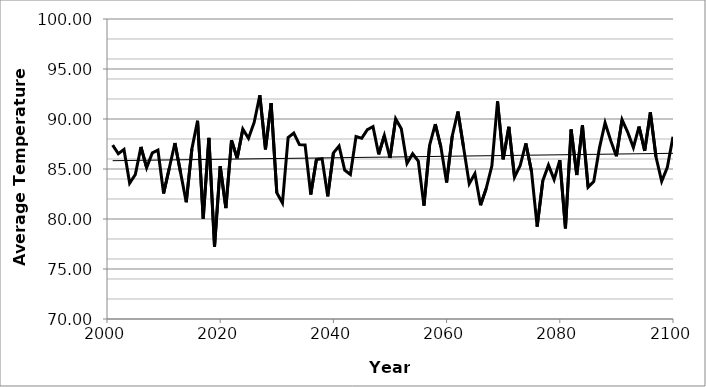
| Category | Committed |
|---|---|
| 2001.0 | 87.39 |
| 2002.0 | 86.527 |
| 2003.0 | 86.954 |
| 2004.0 | 83.583 |
| 2005.0 | 84.441 |
| 2006.0 | 87.208 |
| 2007.0 | 85.127 |
| 2008.0 | 86.603 |
| 2009.0 | 86.891 |
| 2010.0 | 82.553 |
| 2011.0 | 85.073 |
| 2012.0 | 87.604 |
| 2013.0 | 84.637 |
| 2014.0 | 81.673 |
| 2015.0 | 87.017 |
| 2016.0 | 89.829 |
| 2017.0 | 80.037 |
| 2018.0 | 88.11 |
| 2019.0 | 77.239 |
| 2020.0 | 85.269 |
| 2021.0 | 81.093 |
| 2022.0 | 87.87 |
| 2023.0 | 86.077 |
| 2024.0 | 88.99 |
| 2025.0 | 88.077 |
| 2026.0 | 89.654 |
| 2027.0 | 92.372 |
| 2028.0 | 86.956 |
| 2029.0 | 91.591 |
| 2030.0 | 82.621 |
| 2031.0 | 81.599 |
| 2032.0 | 88.151 |
| 2033.0 | 88.597 |
| 2034.0 | 87.444 |
| 2035.0 | 87.402 |
| 2036.0 | 82.447 |
| 2037.0 | 85.944 |
| 2038.0 | 86.027 |
| 2039.0 | 82.267 |
| 2040.0 | 86.605 |
| 2041.0 | 87.296 |
| 2042.0 | 84.886 |
| 2043.0 | 84.447 |
| 2044.0 | 88.246 |
| 2045.0 | 88.075 |
| 2046.0 | 88.932 |
| 2047.0 | 89.238 |
| 2048.0 | 86.463 |
| 2049.0 | 88.347 |
| 2050.0 | 86.106 |
| 2051.0 | 90.012 |
| 2052.0 | 89.029 |
| 2053.0 | 85.554 |
| 2054.0 | 86.526 |
| 2055.0 | 85.78 |
| 2056.0 | 81.334 |
| 2057.0 | 87.381 |
| 2058.0 | 89.496 |
| 2059.0 | 87.181 |
| 2060.0 | 83.647 |
| 2061.0 | 88.309 |
| 2062.0 | 90.739 |
| 2063.0 | 87.154 |
| 2064.0 | 83.529 |
| 2065.0 | 84.54 |
| 2066.0 | 81.381 |
| 2067.0 | 83.057 |
| 2068.0 | 85.321 |
| 2069.0 | 91.762 |
| 2070.0 | 85.969 |
| 2071.0 | 89.22 |
| 2072.0 | 84.177 |
| 2073.0 | 85.345 |
| 2074.0 | 87.561 |
| 2075.0 | 84.762 |
| 2076.0 | 79.239 |
| 2077.0 | 83.831 |
| 2078.0 | 85.388 |
| 2079.0 | 83.939 |
| 2080.0 | 85.883 |
| 2081.0 | 79.068 |
| 2082.0 | 88.95 |
| 2083.0 | 84.398 |
| 2084.0 | 89.366 |
| 2085.0 | 83.188 |
| 2086.0 | 83.752 |
| 2087.0 | 87.085 |
| 2088.0 | 89.622 |
| 2089.0 | 87.836 |
| 2090.0 | 86.279 |
| 2091.0 | 89.929 |
| 2092.0 | 88.675 |
| 2093.0 | 87.145 |
| 2094.0 | 89.245 |
| 2095.0 | 86.81 |
| 2096.0 | 90.657 |
| 2097.0 | 86.196 |
| 2098.0 | 83.768 |
| 2099.0 | 85.174 |
| 2100.0 | 88.214 |